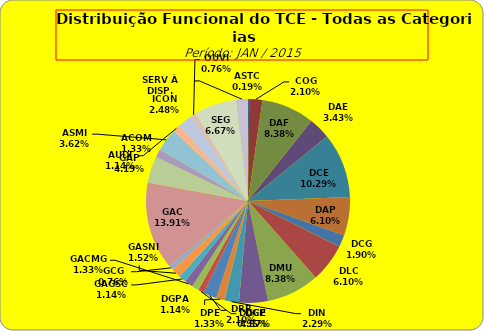
| Category | ASTC COG DAF DAE DCE DAP DCG DLC DMU DGP DIN DPE DRR DGCE DGPA GACMG GAGSC GASNI GCG GAC GAP ACOM ASMI AUDI ICON OUVI SEG SERV À DISP. |
|---|---|
| ASTC | 1 |
| COG | 11 |
| DAF | 44 |
| DAE | 18 |
| DCE | 54 |
| DAP | 32 |
| DCG | 10 |
| DLC | 32 |
| DMU | 44 |
| DGP | 24 |
| DIN | 12 |
| DPE | 7 |
| DRR | 11 |
| DGCE | 5 |
| DGPA | 6 |
| GACMG | 7 |
| GAGSC | 6 |
| GASNI | 8 |
| GCG | 4 |
| GAC | 73 |
| GAP | 22 |
| ACOM | 7 |
| ASMI | 19 |
| AUDI | 6 |
| ICON | 13 |
| OUVI | 4 |
| SEG | 35 |
| SERV À DISP. | 10 |